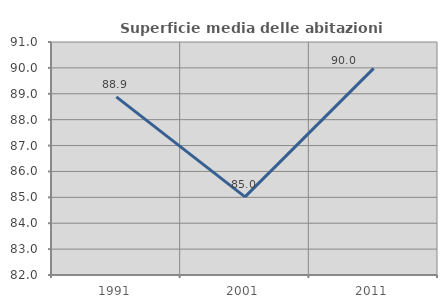
| Category | Superficie media delle abitazioni occupate |
|---|---|
| 1991.0 | 88.882 |
| 2001.0 | 85.019 |
| 2011.0 | 89.983 |